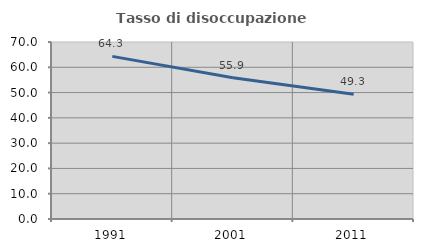
| Category | Tasso di disoccupazione giovanile  |
|---|---|
| 1991.0 | 64.315 |
| 2001.0 | 55.862 |
| 2011.0 | 49.296 |